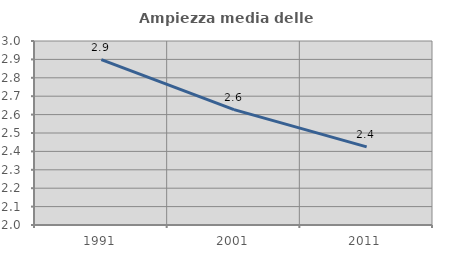
| Category | Ampiezza media delle famiglie |
|---|---|
| 1991.0 | 2.899 |
| 2001.0 | 2.627 |
| 2011.0 | 2.424 |